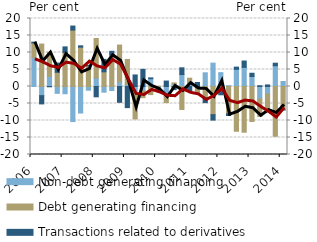
| Category | Non-debt generating financing | Debt generating financing | Transactions related to derivatives |
|---|---|---|---|
| 2006.0 | 8.543 | 4.248 | 0.258 |
| 2006.0 | -2.691 | 12.48 | -2.43 |
| 2006.0 | 2.993 | 7.06 | -0.083 |
| 2006.0 | -2.011 | 4.176 | 2.728 |
| 2007.0 | -2.131 | 10.022 | 1.629 |
| 2007.0 | -10.309 | 16.592 | 1.187 |
| 2007.0 | -7.803 | 11.578 | 0.386 |
| 2007.0 | -1.089 | 6.05 | 0.178 |
| 2008.0 | 2.491 | 11.626 | -3.029 |
| 2008.0 | -1.671 | 4.319 | 3.653 |
| 2008.0 | -1.182 | 9.293 | 1.056 |
| 2008.0 | 1.4 | 10.785 | -4.644 |
| 2009.0 | 0.6 | 7.362 | -6.214 |
| 2009.0 | -2.401 | -7.151 | 3.397 |
| 2009.0 | -1.308 | -1.969 | 5.042 |
| 2009.0 | 2.282 | -2.383 | 0.25 |
| 2010.0 | -0.739 | 0.063 | -0.117 |
| 2010.0 | -2.991 | -1.739 | 1.598 |
| 2010.0 | 0.754 | 0.308 | -0.915 |
| 2010.0 | 3.507 | -6.756 | 1.989 |
| 2011.0 | 1.152 | 1.292 | -1.451 |
| 2011.0 | -0.235 | -1.539 | 1.172 |
| 2011.0 | 4.027 | -3.334 | -1.406 |
| 2011.0 | 6.874 | -8.287 | -1.6 |
| 2012.0 | 4.073 | -1.446 | -0.99 |
| 2012.0 | 0.247 | -8.035 | -0.491 |
| 2012.0 | 5.056 | -13.171 | 0.641 |
| 2012.0 | 5.625 | -13.446 | 1.866 |
| 2013.0 | 2.944 | -10.285 | 0.952 |
| 2013.0 | -3.692 | -5.134 | 0.215 |
| 2013.0 | -2.22 | -5.198 | 0.457 |
| 2013.0 | 6.105 | -14.643 | 0.745 |
| 2014.0 | 1.469 | -6.865 | -0.021 |